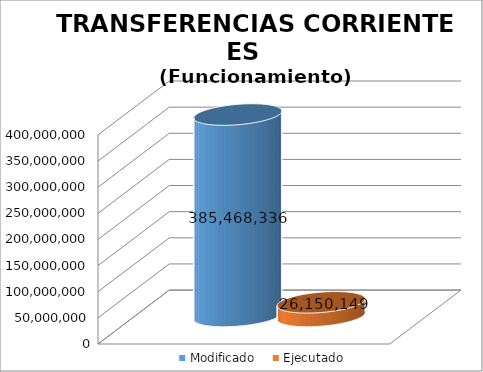
| Category | Modificado | Ejecutado |
|---|---|---|
| 0 | 385468336 | 26150148.96 |